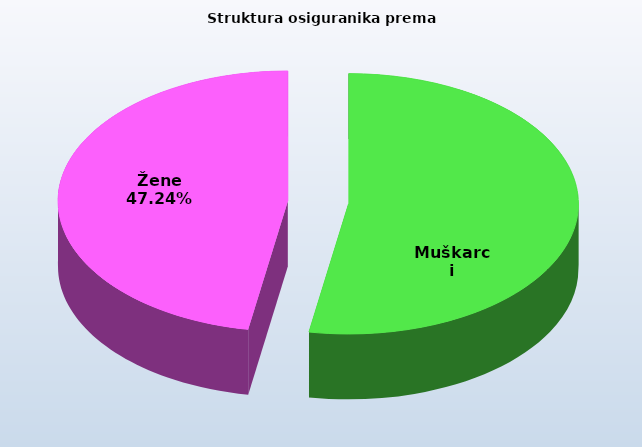
| Category | Series 0 |
|---|---|
| Muškarci | 815182 |
| Žene | 730010 |